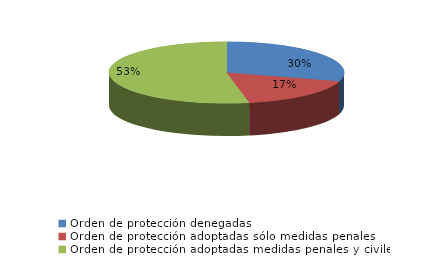
| Category | Series 0 |
|---|---|
| Orden de protección denegadas | 24 |
| Orden de protección adoptadas sólo medidas penales | 14 |
| Orden de protección adoptadas medidas penales y civiles | 43 |